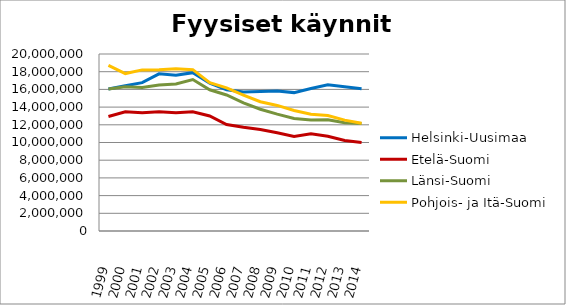
| Category | Helsinki-Uusimaa | Etelä-Suomi | Länsi-Suomi | Pohjois- ja Itä-Suomi |
|---|---|---|---|---|
| 1999.0 | 16040251 | 12941801 | 16057909 | 18724870 |
| 2000.0 | 16415594 | 13475253 | 16297341 | 17789986 |
| 2001.0 | 16766734 | 13364527 | 16222073 | 18204794 |
| 2002.0 | 17760917 | 13476868 | 16504458 | 18230885 |
| 2003.0 | 17602222 | 13350855 | 16606654 | 18346717 |
| 2004.0 | 17888985 | 13473820 | 17113522 | 18229559 |
| 2005.0 | 16711609 | 13001361 | 15960809 | 16767609 |
| 2006.0 | 15960276 | 12031153 | 15369704 | 16164756 |
| 2007.0 | 15713704 | 11717197 | 14475670 | 15365616 |
| 2008.0 | 15770443 | 11467665 | 13762460 | 14605814 |
| 2009.0 | 15828776 | 11095475 | 13204250 | 14190957 |
| 2010.0 | 15637428 | 10676262 | 12713486 | 13620080 |
| 2011.0 | 16094393 | 10976798 | 12538723 | 13187088 |
| 2012.0 | 16511301 | 10712835 | 12570710 | 13043587 |
| 2013.0 | 16311603 | 10227626 | 12225812 | 12528236 |
| 2014.0 | 16071964 | 10007763 | 12133843.5 | 12165749 |